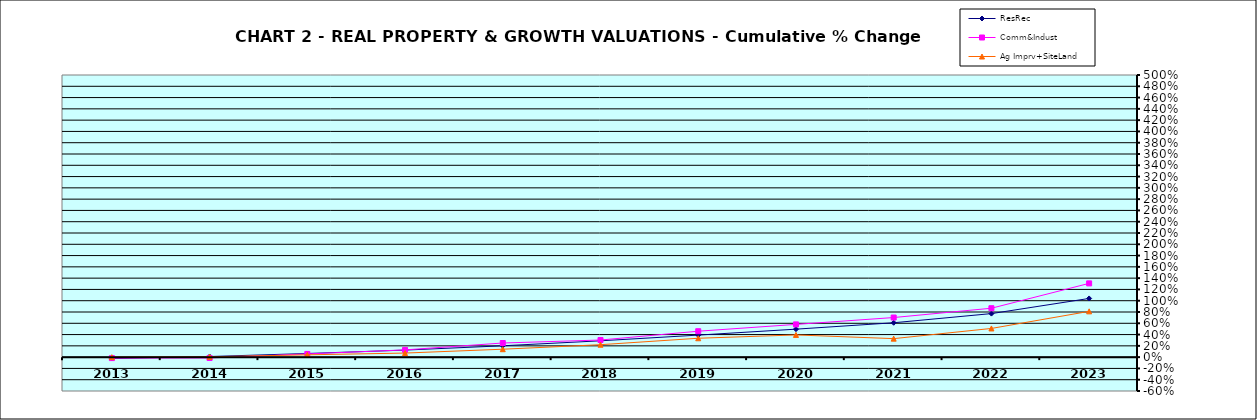
| Category | ResRec | Comm&Indust | Ag Imprv+SiteLand |
|---|---|---|---|
| 2013.0 | -0.022 | -0.017 | 0 |
| 2014.0 | 0.011 | -0.014 | 0.006 |
| 2015.0 | 0.065 | 0.057 | 0.041 |
| 2016.0 | 0.125 | 0.128 | 0.072 |
| 2017.0 | 0.201 | 0.25 | 0.141 |
| 2018.0 | 0.29 | 0.303 | 0.221 |
| 2019.0 | 0.391 | 0.459 | 0.335 |
| 2020.0 | 0.496 | 0.58 | 0.394 |
| 2021.0 | 0.609 | 0.702 | 0.328 |
| 2022.0 | 0.772 | 0.867 | 0.509 |
| 2023.0 | 1.04 | 1.307 | 0.812 |